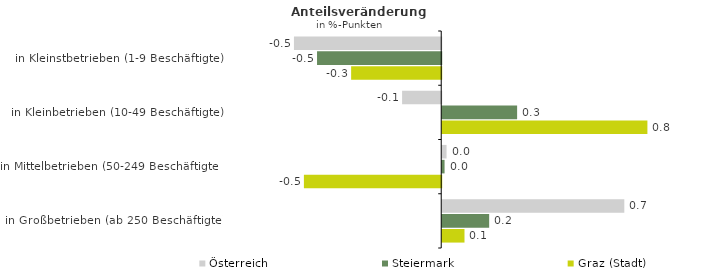
| Category | Österreich | Steiermark | Graz (Stadt) |
|---|---|---|---|
| in Kleinstbetrieben (1-9 Beschäftigte) | -0.55 | -0.464 | -0.336 |
| in Kleinbetrieben (10-49 Beschäftigte) | -0.146 | 0.28 | 0.766 |
| in Mittelbetrieben (50-249 Beschäftigte) | 0.016 | 0.009 | -0.513 |
| in Großbetrieben (ab 250 Beschäftigte) | 0.68 | 0.175 | 0.083 |